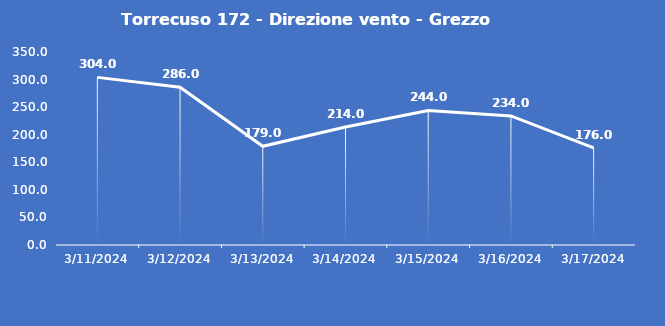
| Category | Torrecuso 172 - Direzione vento - Grezzo (°N) |
|---|---|
| 3/11/24 | 304 |
| 3/12/24 | 286 |
| 3/13/24 | 179 |
| 3/14/24 | 214 |
| 3/15/24 | 244 |
| 3/16/24 | 234 |
| 3/17/24 | 176 |